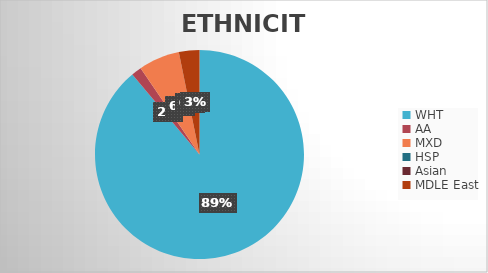
| Category | Series 0 |
|---|---|
| WHT | 56 |
| AA | 1 |
| MXD | 4 |
| HSP | 0 |
| Asian | 0 |
| MDLE East | 2 |